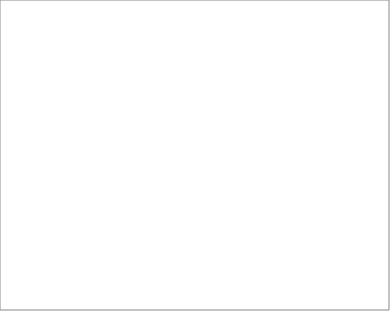
| Category | 2004 | 2005 | 2006 | 2008 | 2009 | 2010 | 2011 | 2012 | 2013 |
|---|---|---|---|---|---|---|---|---|---|
| dolnośląskie |  |  | 7 | 13 | 20 | 16 |  | 6 | 3 |